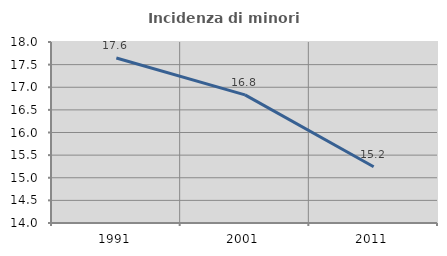
| Category | Incidenza di minori stranieri |
|---|---|
| 1991.0 | 17.647 |
| 2001.0 | 16.832 |
| 2011.0 | 15.244 |